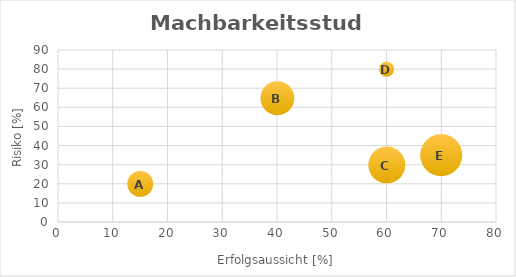
| Category | Risiko
[%] |
|---|---|
| 15.0 | 20 |
| 40.0 | 65 |
| 60.0 | 30 |
| 60.0 | 80 |
| 70.0 | 35 |